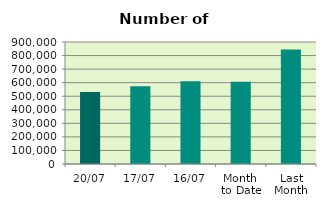
| Category | Series 0 |
|---|---|
| 20/07 | 530466 |
| 17/07 | 572876 |
| 16/07 | 609822 |
| Month 
to Date | 607437 |
| Last
Month | 844726.818 |